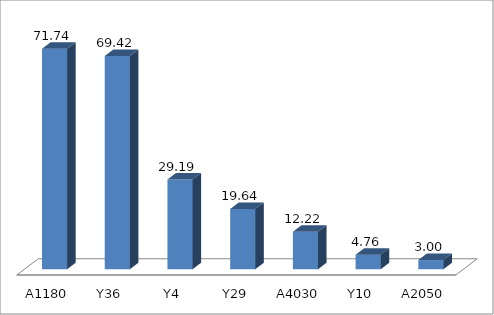
| Category | Series 0 |
|---|---|
| A1180 | 71.743 |
| Y36 | 69.419 |
| Y4 | 29.19 |
| Y29 | 19.639 |
| A4030 | 12.221 |
| Y10 | 4.756 |
| A2050 | 2.996 |